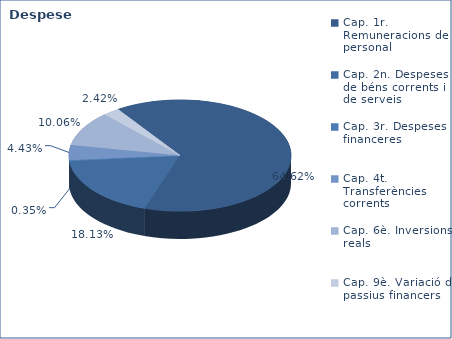
| Category | Series 0 |
|---|---|
| Cap. 1r. Remuneracions de personal | 182983800 |
| Cap. 2n. Despeses de béns corrents i de serveis | 51343297 |
| Cap. 3r. Despeses financeres | 977245 |
| Cap. 4t. Transferències corrents | 12547722 |
| Cap. 6è. Inversions reals | 28486252 |
| Cap. 9è. Variació de passius financers | 6846938 |